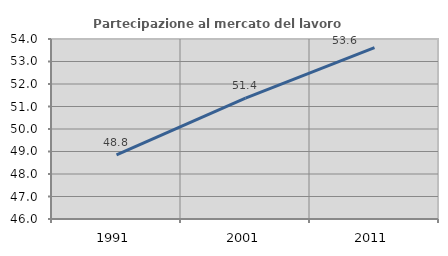
| Category | Partecipazione al mercato del lavoro  femminile |
|---|---|
| 1991.0 | 48.85 |
| 2001.0 | 51.377 |
| 2011.0 | 53.616 |